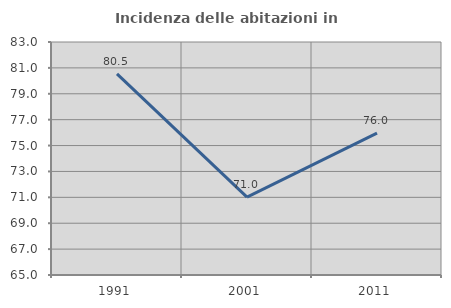
| Category | Incidenza delle abitazioni in proprietà  |
|---|---|
| 1991.0 | 80.534 |
| 2001.0 | 71.02 |
| 2011.0 | 75.954 |